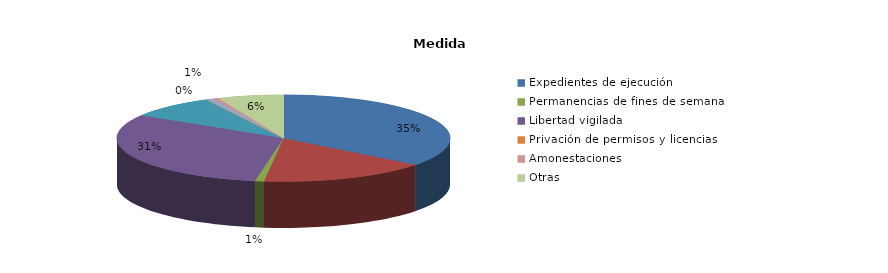
| Category | Series 0 |
|---|---|
| Expedientes de ejecución | 1574 |
| Internamientos | 725 |
| Permanencias de fines de semana | 39 |
| Libertad vigilada | 1380 |
| Prestaciones en beneficio de la comunidad | 378 |
| Privación de permisos y licencias | 0 |
| Convivencia Familiar Educativa | 31 |
| Amonestaciones | 25 |
| Otras | 282 |